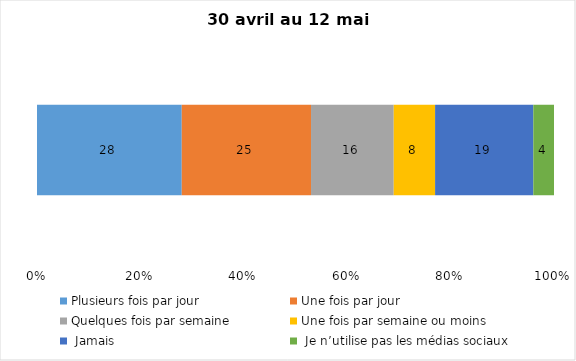
| Category | Plusieurs fois par jour | Une fois par jour | Quelques fois par semaine   | Une fois par semaine ou moins   |  Jamais   |  Je n’utilise pas les médias sociaux |
|---|---|---|---|---|---|---|
| 0 | 28 | 25 | 16 | 8 | 19 | 4 |